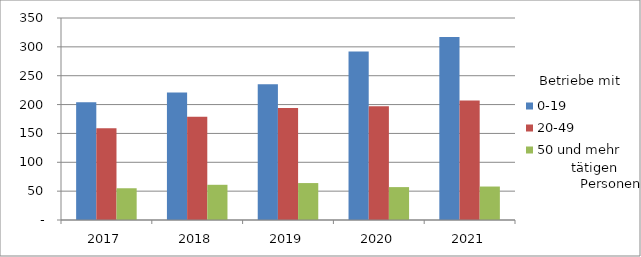
| Category | 0-19 | 20-49 | 50 und mehr |
|---|---|---|---|
| 2017.0 | 204 | 159 | 55 |
| 2018.0 | 221 | 179 | 61 |
| 2019.0 | 235 | 194 | 64 |
| 2020.0 | 292 | 197 | 57 |
| 2021.0 | 317 | 207 | 58 |